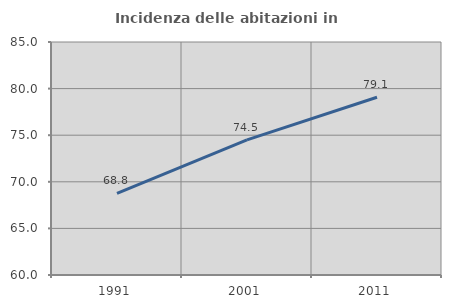
| Category | Incidenza delle abitazioni in proprietà  |
|---|---|
| 1991.0 | 68.756 |
| 2001.0 | 74.496 |
| 2011.0 | 79.067 |